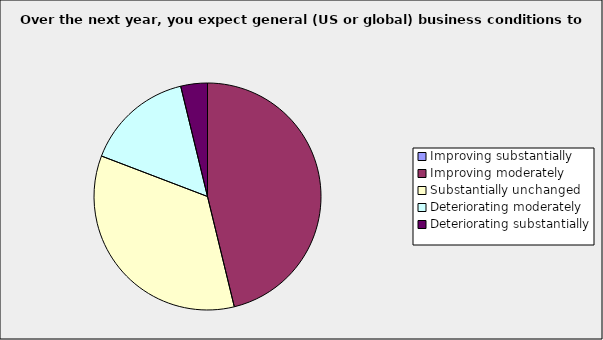
| Category | Series 0 |
|---|---|
| Improving substantially | 0 |
| Improving moderately | 0.462 |
| Substantially unchanged | 0.346 |
| Deteriorating moderately | 0.154 |
| Deteriorating substantially | 0.038 |